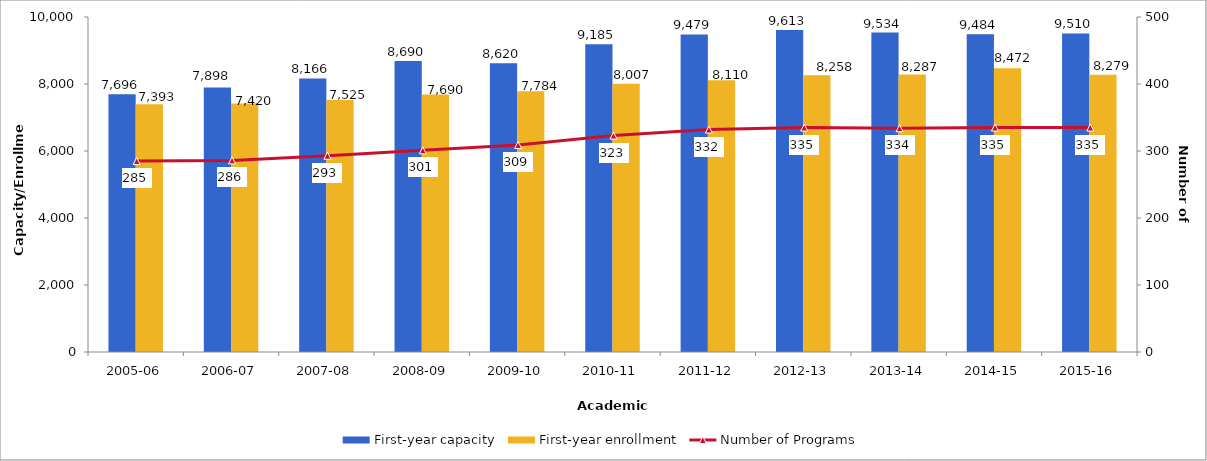
| Category | First-year capacity | First-year enrollment |
|---|---|---|
| 2005-06 | 7696 | 7393 |
| 2006-07 | 7898 | 7420 |
| 2007-08 | 8166 | 7525 |
| 2008-09 | 8690 | 7690 |
| 2009-10 | 8620 | 7784 |
| 2010-11 | 9185 | 8007 |
| 2011-12 | 9479 | 8110 |
| 2012-13 | 9613 | 8258 |
| 2013-14 | 9534 | 8287 |
| 2014-15 | 9484 | 8472 |
| 2015-16 | 9510 | 8279 |